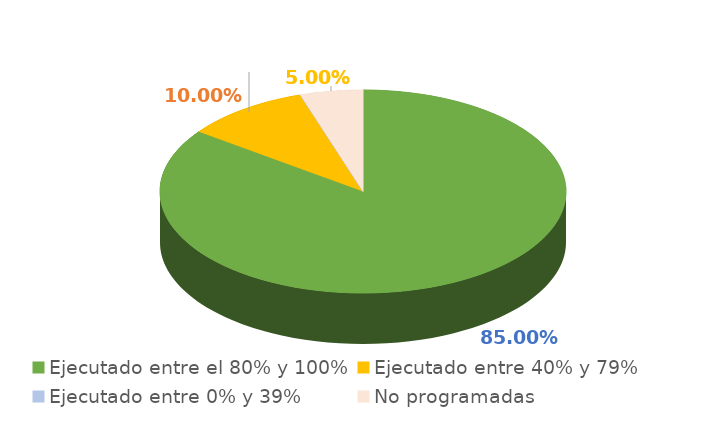
| Category | Series 0 |
|---|---|
| Ejecutado entre el 80% y 100% | 0.85 |
| Ejecutado entre 40% y 79% | 0.1 |
| Ejecutado entre 0% y 39% | 0 |
| No programadas | 0.05 |